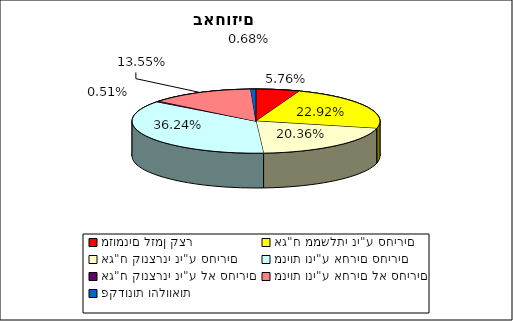
| Category | Series 0 |
|---|---|
| מזומנים לזמן קצר | 0.058 |
| אג"ח ממשלתי ני"ע סחירים | 0.229 |
| אג"ח קונצרני ני"ע סחירים | 0.204 |
| מניות וני"ע אחרים סחירים | 0.362 |
| אג"ח קונצרני ני"ע לא סחירים | 0.005 |
| מניות וני"ע אחרים לא סחירים | 0.136 |
| פקדונות והלוואות | 0.007 |